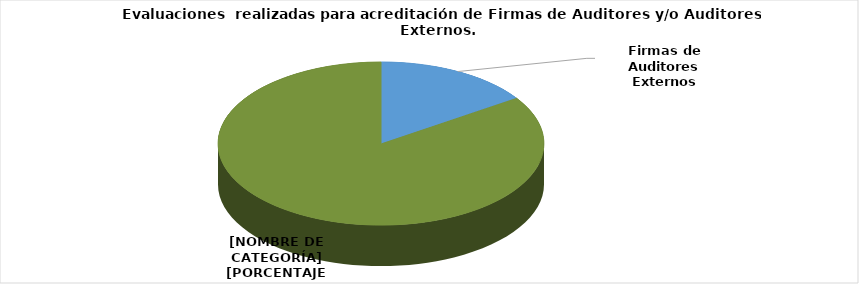
| Category | Series 0 |
|---|---|
| Firmas de Auditores Externos | 12 |
| Auditores Externos | 65 |